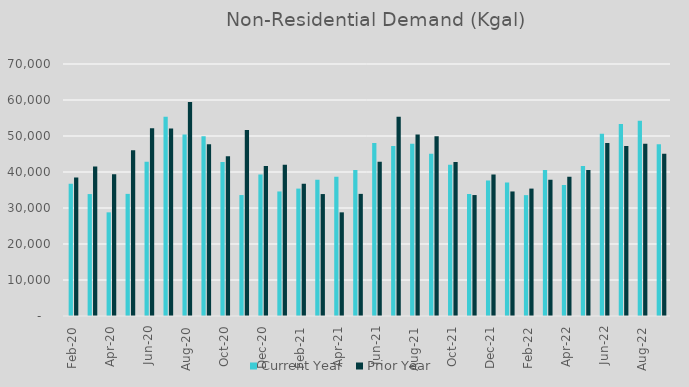
| Category | Current Year | Prior Year |
|---|---|---|
| 2020-02-01 | 36720 | 38439 |
| 2020-03-01 | 33872 | 41545 |
| 2020-04-01 | 28794 | 39390 |
| 2020-05-01 | 33923 | 46068 |
| 2020-06-01 | 42862 | 52164 |
| 2020-07-01 | 55350 | 52094 |
| 2020-08-01 | 50435 | 59449 |
| 2020-09-01 | 49956 | 47706 |
| 2020-10-01 | 42806 | 44393 |
| 2020-11-01 | 33597 | 51699 |
| 2020-12-01 | 39277 | 41635 |
| 2021-01-01 | 34595 | 42003 |
| 2021-02-01 | 35390 | 36720 |
| 2021-03-01 | 37846 | 33872 |
| 2021-04-01 | 38666 | 28794 |
| 2021-05-01 | 40521 | 33923 |
| 2021-06-01 | 48058 | 42862 |
| 2021-07-01 | 47251 | 55350 |
| 2021-08-01 | 47854 | 50435 |
| 2021-09-01 | 45089 | 49956 |
| 2021-10-01 | 41999 | 42806 |
| 2021-11-01 | 33892 | 33597 |
| 2021-12-01 | 37668 | 39277 |
| 2022-01-01 | 37113 | 34595 |
| 2022-02-01 | 33575 | 35390 |
| 2022-03-01 | 40528 | 37846 |
| 2022-04-01 | 36391 | 38666 |
| 2022-05-01 | 41660 | 40521 |
| 2022-06-01 | 50657 | 48058 |
| 2022-07-01 | 53316 | 47251 |
| 2022-08-01 | 54245 | 47854 |
| 2022-09-01 | 47677 | 45089 |